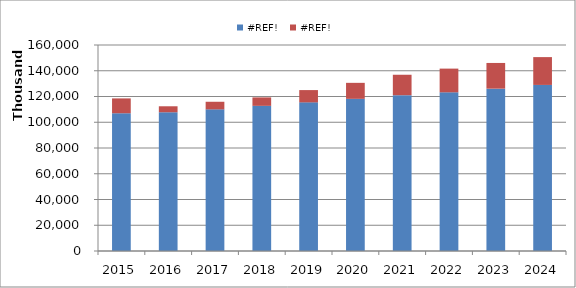
| Category | #REF! |
|---|---|
| 2015.0 | 11530995 |
| 2016.0 | 4643675 |
| 2017.0 | 5894400 |
| 2018.0 | 6545408 |
| 2019.0 | 9545213 |
| 2020.0 | 12412574 |
| 2021.0 | 15876569 |
| 2022.0 | 18412299 |
| 2023.0 | 19971932 |
| 2024.0 | 21615231 |